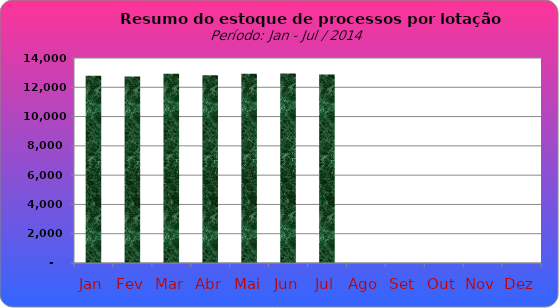
| Category | Series 0 |
|---|---|
| Jan | 12795 |
| Fev | 12744 |
| Mar | 12928 |
| Abr | 12816 |
| Mai | 12923 |
| Jun | 12943 |
| Jul | 12869 |
| Ago | 0 |
| Set | 0 |
| Out | 0 |
| Nov | 0 |
| Dez | 0 |